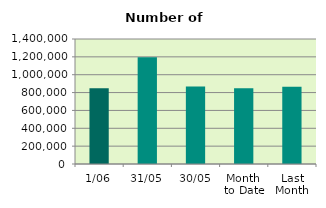
| Category | Series 0 |
|---|---|
| 1/06 | 848572 |
| 31/05 | 1194208 |
| 30/05 | 866820 |
| Month 
to Date | 848572 |
| Last
Month | 864947.182 |